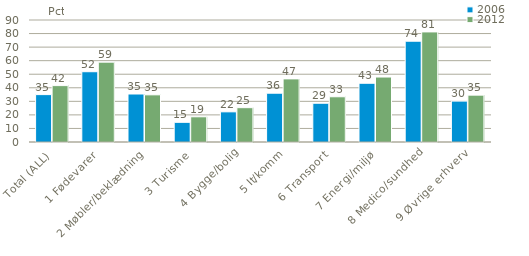
| Category | 2006 | 2012 |
|---|---|---|
| Total (ALL) | 34.959 | 41.59 |
| 1 Fødevarer | 51.837 | 58.918 |
| 2 Møbler/beklædning | 35.409 | 34.795 |
| 3 Turisme | 14.517 | 18.597 |
| 4 Bygge/bolig | 22.251 | 25.317 |
| 5 It/komm | 35.993 | 46.557 |
| 6 Transport | 28.592 | 33.363 |
| 7 Energi/miljø | 43.318 | 47.924 |
| 8 Medico/sundhed | 74.357 | 81.206 |
| 9 Øvrige erhverv | 30.181 | 34.562 |